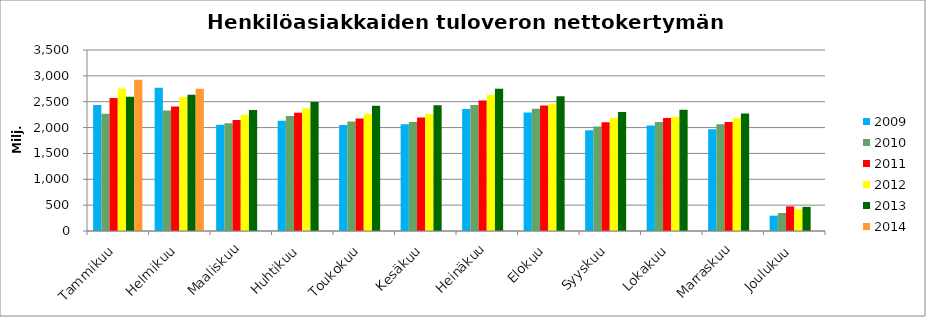
| Category | 2009 | 2010 | 2011 | 2012 | 2013 | 2014 |
|---|---|---|---|---|---|---|
| Tammikuu | 2438.489 | 2267.873 | 2569.442 | 2754.468 | 2597.268 | 2923.115 |
| Helmikuu | 2771.607 | 2330.409 | 2406.04 | 2591.616 | 2636.607 | 2751.009 |
| Maaliskuu | 2054.852 | 2084.249 | 2145.291 | 2250.057 | 2340.316 | 0 |
| Huhtikuu | 2131.066 | 2225.487 | 2285.914 | 2375.631 | 2492.368 | 0 |
| Toukokuu | 2051.558 | 2117.095 | 2177.688 | 2264.689 | 2423.516 | 0 |
| Kesäkuu | 2063.182 | 2109.339 | 2194.481 | 2268.001 | 2432.777 | 0 |
| Heinäkuu | 2357.008 | 2435.026 | 2524.383 | 2633.57 | 2750.145 | 0 |
| Elokuu | 2289.863 | 2364.596 | 2427.052 | 2461.949 | 2607.529 | 0 |
| Syyskuu | 1946.167 | 2019.118 | 2102.001 | 2184.152 | 2299.363 | 0 |
| Lokakuu | 2041.676 | 2107.95 | 2185.045 | 2211.144 | 2342.648 | 0 |
| Marraskuu | 1967.798 | 2063.457 | 2106.752 | 2183.43 | 2270.307 | 0 |
| Joulukuu | 296.354 | 347.927 | 476.484 | 421.857 | 466.039 | 0 |